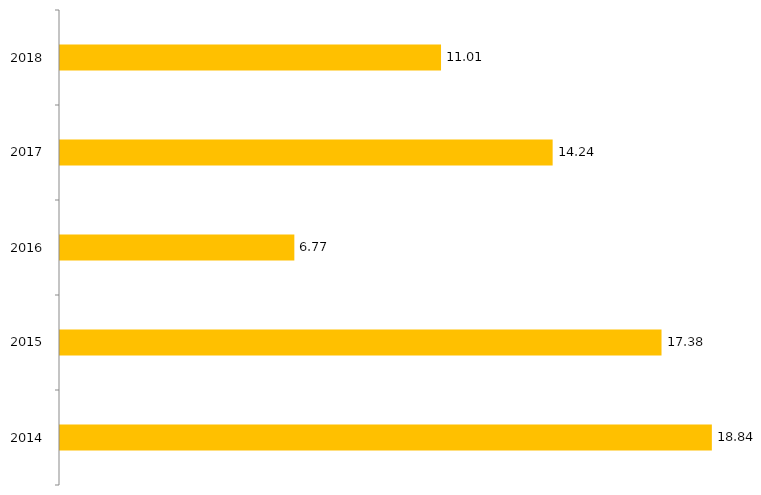
| Category | Relaçãocandidato x vaga sisu |
|---|---|
| 2014.0 | 18.84 |
| 2015.0 | 17.385 |
| 2016.0 | 6.773 |
| 2017.0 | 14.238 |
| 2018.0 | 11.012 |